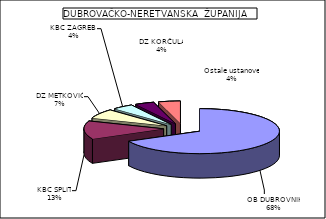
| Category | Series 0 |
|---|---|
| OB DUBROVNIK | 67.601 |
| KBC SPLIT | 13.059 |
| DZ METKOVIĆ | 6.782 |
| KBC ZAGREB  | 4.235 |
| DZ KORČULA | 3.88 |
| Ostale ustanove | 4.443 |